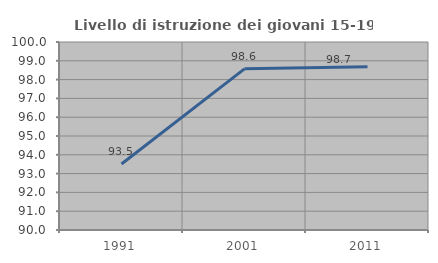
| Category | Livello di istruzione dei giovani 15-19 anni |
|---|---|
| 1991.0 | 93.514 |
| 2001.0 | 98.571 |
| 2011.0 | 98.684 |